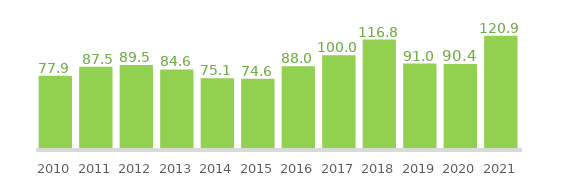
| Category | Investimento em I&D  (M€) |
|---|---|
| 2010.0 | 77.905 |
| 2011.0 | 87.5 |
| 2012.0 | 89.5 |
| 2013.0 | 84.567 |
| 2014.0 | 75.1 |
| 2015.0 | 74.6 |
| 2016.0 | 88 |
| 2017.0 | 100 |
| 2018.0 | 116.8 |
| 2019.0 | 91 |
| 2020.0 | 90.4 |
| 2021.0 | 120.944 |